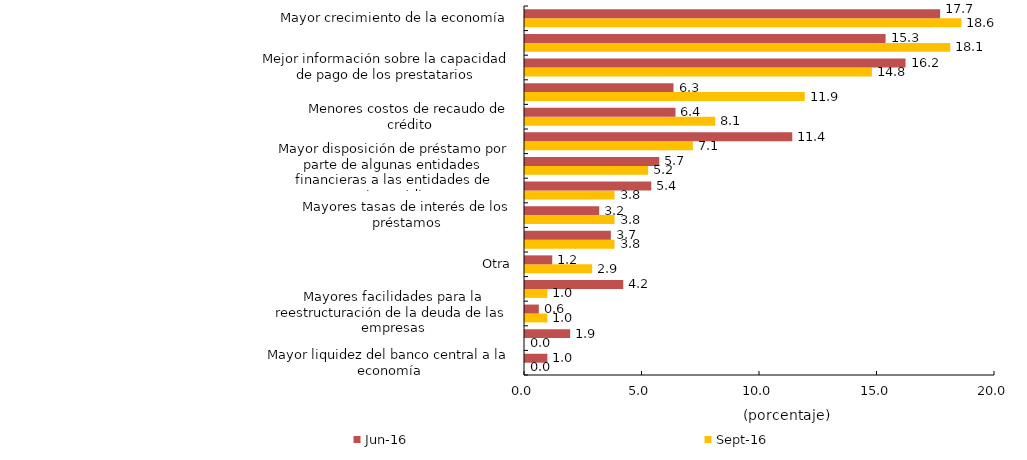
| Category | sep-16 | jun-16 |
|---|---|---|
| Mayor liquidez del banco central a la economía | 0 | 0.952 |
| Mayor capital de las empresas | 0 | 1.922 |
| Mayores facilidades para la reestructuración de la deuda de las empresas | 0.952 | 0.588 |
| Mayor capital de las entidades de microcrédito | 0.952 | 4.181 |
| Otra | 2.857 | 1.16 |
| Proyectos más rentables | 3.81 | 3.653 |
| Mayores tasas de interés de los préstamos | 3.81 | 3.159 |
| Extensión de garantías del sector público a proyectos del sector real | 3.81 | 5.374 |
| Mayor disposición de préstamo por parte de algunas entidades financieras a las entidades de microcrédito | 5.238 | 5.714 |
| Acceso a fondos de redescuento agropecuario | 7.143 | 11.373 |
| Menores costos de recaudo de crédito | 8.095 | 6.403 |
| Mayor formalización | 11.905 | 6.319 |
| Mejor información sobre la capacidad de pago de los prestatarios | 14.762 | 16.193 |
| Menores tasas de fondeo | 18.095 | 15.344 |
| Mayor crecimiento de la economía | 18.571 | 17.664 |